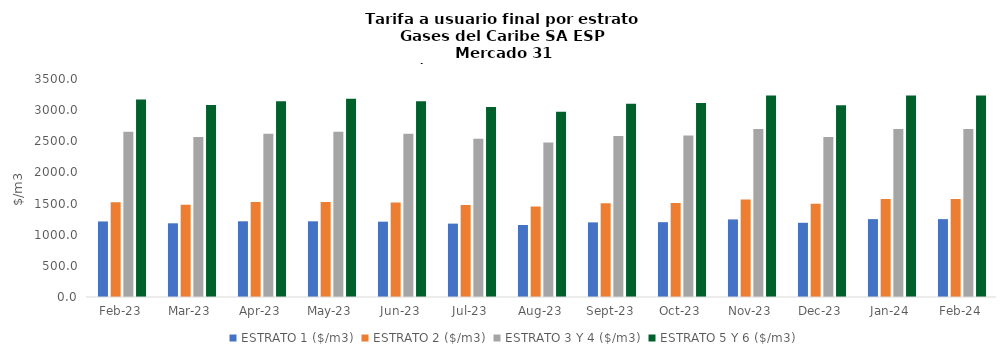
| Category | ESTRATO 1 ($/m3) | ESTRATO 2 ($/m3) | ESTRATO 3 Y 4 ($/m3) | ESTRATO 5 Y 6 ($/m3) |
|---|---|---|---|---|
| 2023-02-01 | 1212.89 | 1521.57 | 2651.33 | 3170.196 |
| 2023-03-01 | 1183.19 | 1482.78 | 2568.94 | 3082.728 |
| 2023-04-01 | 1215.25 | 1524.46 | 2619.03 | 3142.836 |
| 2023-05-01 | 1215.25 | 1524.46 | 2651.33 | 3181.596 |
| 2023-06-01 | 1209.41 | 1517.12 | 2619.03 | 3142.836 |
| 2023-07-01 | 1178 | 1477.97 | 2542.18 | 3050.616 |
| 2023-08-01 | 1155.93 | 1451.92 | 2479.28 | 2975.136 |
| 2023-09-01 | 1198 | 1503.27 | 2586.8 | 3104.16 |
| 2023-10-01 | 1201.13 | 1507.69 | 2594.42 | 3113.304 |
| 2023-11-01 | 1245.69 | 1564.66 | 2697.24 | 3236.688 |
| 2023-12-01 | 1191.7 | 1497.74 | 2567.03 | 3080.436 |
| 2024-01-01 | 1250.09 | 1571.48 | 2695.95 | 3235.14 |
| 2024-02-01 | 1250.09 | 1571.48 | 2695.95 | 3235.14 |